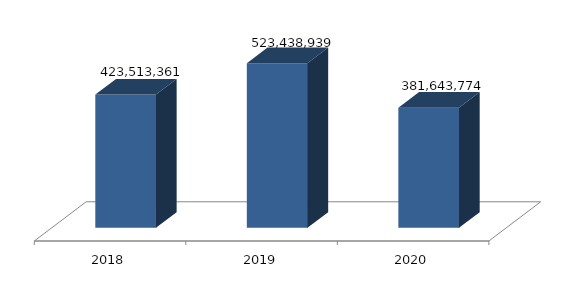
| Category | Series 0 |
|---|---|
| 0 | 423513361 |
| 1 | 523438939 |
| 2 | 381643774 |